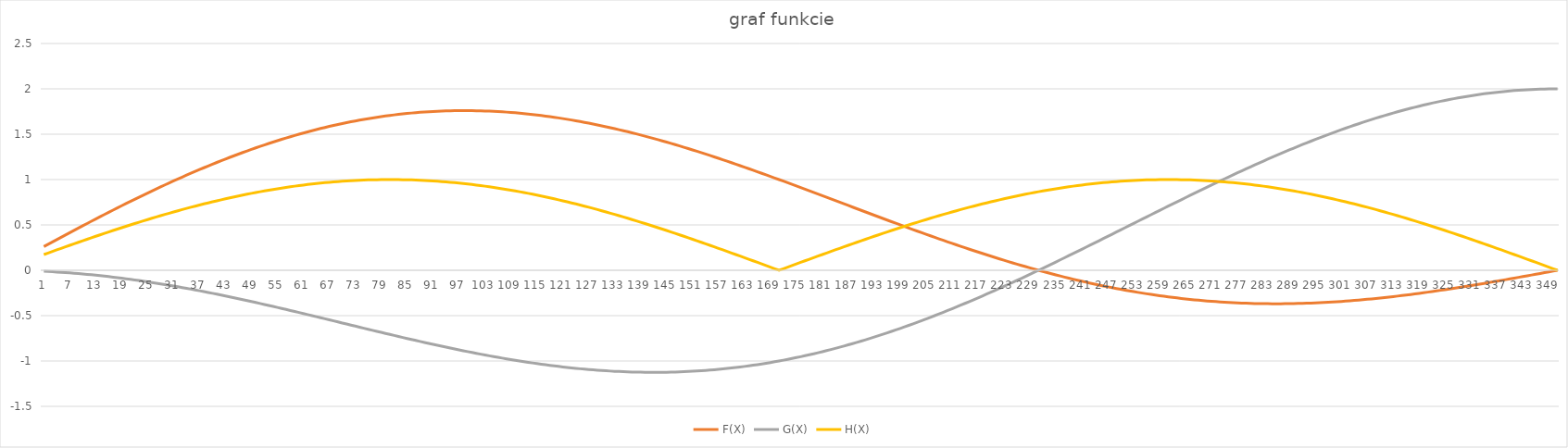
| Category | F(X) | G(X) | H(X) |
|---|---|---|---|
| 0 | 0.261 | -0.011 | 0.174 |
| 1 | 0.287 | -0.014 | 0.191 |
| 2 | 0.312 | -0.016 | 0.208 |
| 3 | 0.338 | -0.019 | 0.225 |
| 4 | 0.364 | -0.022 | 0.242 |
| 5 | 0.389 | -0.026 | 0.259 |
| 6 | 0.415 | -0.029 | 0.276 |
| 7 | 0.44 | -0.033 | 0.292 |
| 8 | 0.465 | -0.037 | 0.309 |
| 9 | 0.491 | -0.041 | 0.326 |
| 10 | 0.516 | -0.045 | 0.342 |
| 11 | 0.541 | -0.05 | 0.358 |
| 12 | 0.565 | -0.054 | 0.375 |
| 13 | 0.59 | -0.059 | 0.391 |
| 14 | 0.615 | -0.065 | 0.407 |
| 15 | 0.639 | -0.07 | 0.423 |
| 16 | 0.663 | -0.076 | 0.438 |
| 17 | 0.687 | -0.081 | 0.454 |
| 18 | 0.711 | -0.087 | 0.469 |
| 19 | 0.735 | -0.094 | 0.485 |
| 20 | 0.759 | -0.1 | 0.5 |
| 21 | 0.782 | -0.106 | 0.515 |
| 22 | 0.806 | -0.113 | 0.53 |
| 23 | 0.829 | -0.12 | 0.545 |
| 24 | 0.852 | -0.127 | 0.559 |
| 25 | 0.874 | -0.135 | 0.574 |
| 26 | 0.897 | -0.142 | 0.588 |
| 27 | 0.919 | -0.15 | 0.602 |
| 28 | 0.941 | -0.158 | 0.616 |
| 29 | 0.963 | -0.165 | 0.629 |
| 30 | 0.985 | -0.174 | 0.643 |
| 31 | 1.006 | -0.182 | 0.656 |
| 32 | 1.027 | -0.19 | 0.669 |
| 33 | 1.048 | -0.199 | 0.682 |
| 34 | 1.069 | -0.208 | 0.695 |
| 35 | 1.09 | -0.217 | 0.707 |
| 36 | 1.11 | -0.226 | 0.719 |
| 37 | 1.13 | -0.235 | 0.731 |
| 38 | 1.15 | -0.244 | 0.743 |
| 39 | 1.169 | -0.254 | 0.755 |
| 40 | 1.189 | -0.264 | 0.766 |
| 41 | 1.208 | -0.273 | 0.777 |
| 42 | 1.226 | -0.283 | 0.788 |
| 43 | 1.245 | -0.293 | 0.799 |
| 44 | 1.263 | -0.303 | 0.809 |
| 45 | 1.281 | -0.313 | 0.819 |
| 46 | 1.299 | -0.324 | 0.829 |
| 47 | 1.316 | -0.334 | 0.839 |
| 48 | 1.333 | -0.345 | 0.848 |
| 49 | 1.35 | -0.355 | 0.857 |
| 50 | 1.366 | -0.366 | 0.866 |
| 51 | 1.382 | -0.377 | 0.875 |
| 52 | 1.398 | -0.388 | 0.883 |
| 53 | 1.414 | -0.399 | 0.891 |
| 54 | 1.429 | -0.41 | 0.899 |
| 55 | 1.444 | -0.421 | 0.906 |
| 56 | 1.458 | -0.432 | 0.914 |
| 57 | 1.472 | -0.443 | 0.921 |
| 58 | 1.486 | -0.454 | 0.927 |
| 59 | 1.5 | -0.466 | 0.934 |
| 60 | 1.513 | -0.477 | 0.94 |
| 61 | 1.526 | -0.489 | 0.946 |
| 62 | 1.539 | -0.5 | 0.951 |
| 63 | 1.551 | -0.511 | 0.956 |
| 64 | 1.563 | -0.523 | 0.961 |
| 65 | 1.575 | -0.535 | 0.966 |
| 66 | 1.586 | -0.546 | 0.97 |
| 67 | 1.597 | -0.558 | 0.974 |
| 68 | 1.607 | -0.569 | 0.978 |
| 69 | 1.618 | -0.581 | 0.982 |
| 70 | 1.628 | -0.592 | 0.985 |
| 71 | 1.637 | -0.604 | 0.988 |
| 72 | 1.646 | -0.616 | 0.99 |
| 73 | 1.655 | -0.627 | 0.993 |
| 74 | 1.664 | -0.639 | 0.995 |
| 75 | 1.672 | -0.65 | 0.996 |
| 76 | 1.68 | -0.662 | 0.998 |
| 77 | 1.687 | -0.673 | 0.999 |
| 78 | 1.694 | -0.684 | 0.999 |
| 79 | 1.701 | -0.696 | 1 |
| 80 | 1.707 | -0.707 | 1 |
| 81 | 1.713 | -0.718 | 1 |
| 82 | 1.719 | -0.73 | 0.999 |
| 83 | 1.724 | -0.741 | 0.999 |
| 84 | 1.729 | -0.752 | 0.998 |
| 85 | 1.733 | -0.763 | 0.996 |
| 86 | 1.738 | -0.774 | 0.995 |
| 87 | 1.742 | -0.784 | 0.993 |
| 88 | 1.745 | -0.795 | 0.99 |
| 89 | 1.748 | -0.806 | 0.988 |
| 90 | 1.751 | -0.816 | 0.985 |
| 91 | 1.753 | -0.827 | 0.982 |
| 92 | 1.755 | -0.837 | 0.978 |
| 93 | 1.757 | -0.847 | 0.974 |
| 94 | 1.758 | -0.858 | 0.97 |
| 95 | 1.759 | -0.868 | 0.966 |
| 96 | 1.76 | -0.877 | 0.961 |
| 97 | 1.76 | -0.887 | 0.956 |
| 98 | 1.76 | -0.897 | 0.951 |
| 99 | 1.76 | -0.906 | 0.946 |
| 100 | 1.759 | -0.916 | 0.94 |
| 101 | 1.758 | -0.925 | 0.934 |
| 102 | 1.756 | -0.934 | 0.927 |
| 103 | 1.754 | -0.943 | 0.921 |
| 104 | 1.752 | -0.951 | 0.914 |
| 105 | 1.75 | -0.96 | 0.906 |
| 106 | 1.747 | -0.968 | 0.899 |
| 107 | 1.744 | -0.976 | 0.891 |
| 108 | 1.74 | -0.985 | 0.883 |
| 109 | 1.736 | -0.992 | 0.875 |
| 110 | 1.732 | -1 | 0.866 |
| 111 | 1.728 | -1.007 | 0.857 |
| 112 | 1.723 | -1.015 | 0.848 |
| 113 | 1.717 | -1.022 | 0.839 |
| 114 | 1.712 | -1.029 | 0.829 |
| 115 | 1.706 | -1.035 | 0.819 |
| 116 | 1.7 | -1.042 | 0.809 |
| 117 | 1.694 | -1.048 | 0.799 |
| 118 | 1.687 | -1.054 | 0.788 |
| 119 | 1.68 | -1.06 | 0.777 |
| 120 | 1.672 | -1.065 | 0.766 |
| 121 | 1.665 | -1.071 | 0.755 |
| 122 | 1.657 | -1.076 | 0.743 |
| 123 | 1.648 | -1.081 | 0.731 |
| 124 | 1.64 | -1.085 | 0.719 |
| 125 | 1.631 | -1.09 | 0.707 |
| 126 | 1.622 | -1.094 | 0.695 |
| 127 | 1.612 | -1.098 | 0.682 |
| 128 | 1.603 | -1.102 | 0.669 |
| 129 | 1.593 | -1.105 | 0.656 |
| 130 | 1.582 | -1.108 | 0.643 |
| 131 | 1.572 | -1.111 | 0.629 |
| 132 | 1.561 | -1.114 | 0.616 |
| 133 | 1.55 | -1.116 | 0.602 |
| 134 | 1.539 | -1.118 | 0.588 |
| 135 | 1.527 | -1.12 | 0.574 |
| 136 | 1.515 | -1.121 | 0.559 |
| 137 | 1.503 | -1.123 | 0.545 |
| 138 | 1.491 | -1.124 | 0.53 |
| 139 | 1.479 | -1.124 | 0.515 |
| 140 | 1.466 | -1.125 | 0.5 |
| 141 | 1.453 | -1.125 | 0.485 |
| 142 | 1.44 | -1.125 | 0.469 |
| 143 | 1.426 | -1.124 | 0.454 |
| 144 | 1.413 | -1.124 | 0.438 |
| 145 | 1.399 | -1.123 | 0.423 |
| 146 | 1.385 | -1.121 | 0.407 |
| 147 | 1.371 | -1.12 | 0.391 |
| 148 | 1.356 | -1.118 | 0.375 |
| 149 | 1.342 | -1.116 | 0.358 |
| 150 | 1.327 | -1.113 | 0.342 |
| 151 | 1.312 | -1.111 | 0.326 |
| 152 | 1.297 | -1.107 | 0.309 |
| 153 | 1.281 | -1.104 | 0.292 |
| 154 | 1.266 | -1.1 | 0.276 |
| 155 | 1.25 | -1.096 | 0.259 |
| 156 | 1.234 | -1.092 | 0.242 |
| 157 | 1.219 | -1.088 | 0.225 |
| 158 | 1.202 | -1.083 | 0.208 |
| 159 | 1.186 | -1.077 | 0.191 |
| 160 | 1.17 | -1.072 | 0.174 |
| 161 | 1.153 | -1.066 | 0.156 |
| 162 | 1.137 | -1.06 | 0.139 |
| 163 | 1.12 | -1.054 | 0.122 |
| 164 | 1.103 | -1.047 | 0.105 |
| 165 | 1.086 | -1.04 | 0.087 |
| 166 | 1.069 | -1.032 | 0.07 |
| 167 | 1.052 | -1.025 | 0.052 |
| 168 | 1.035 | -1.017 | 0.035 |
| 169 | 1.017 | -1.009 | 0.017 |
| 170 | 1 | -1 | 0 |
| 171 | 0.983 | -0.991 | 0.017 |
| 172 | 0.965 | -0.982 | 0.035 |
| 173 | 0.947 | -0.972 | 0.052 |
| 174 | 0.93 | -0.963 | 0.07 |
| 175 | 0.912 | -0.953 | 0.087 |
| 176 | 0.894 | -0.942 | 0.105 |
| 177 | 0.876 | -0.931 | 0.122 |
| 178 | 0.858 | -0.921 | 0.139 |
| 179 | 0.84 | -0.909 | 0.156 |
| 180 | 0.823 | -0.898 | 0.174 |
| 181 | 0.805 | -0.886 | 0.191 |
| 182 | 0.787 | -0.874 | 0.208 |
| 183 | 0.769 | -0.861 | 0.225 |
| 184 | 0.751 | -0.848 | 0.242 |
| 185 | 0.733 | -0.835 | 0.259 |
| 186 | 0.715 | -0.822 | 0.276 |
| 187 | 0.697 | -0.808 | 0.292 |
| 188 | 0.679 | -0.795 | 0.309 |
| 189 | 0.661 | -0.78 | 0.326 |
| 190 | 0.643 | -0.766 | 0.342 |
| 191 | 0.625 | -0.751 | 0.358 |
| 192 | 0.607 | -0.736 | 0.375 |
| 193 | 0.589 | -0.721 | 0.391 |
| 194 | 0.571 | -0.706 | 0.407 |
| 195 | 0.554 | -0.69 | 0.423 |
| 196 | 0.536 | -0.674 | 0.438 |
| 197 | 0.518 | -0.658 | 0.454 |
| 198 | 0.501 | -0.641 | 0.469 |
| 199 | 0.483 | -0.624 | 0.485 |
| 200 | 0.466 | -0.607 | 0.5 |
| 201 | 0.449 | -0.59 | 0.515 |
| 202 | 0.431 | -0.572 | 0.53 |
| 203 | 0.414 | -0.555 | 0.545 |
| 204 | 0.397 | -0.537 | 0.559 |
| 205 | 0.38 | -0.518 | 0.574 |
| 206 | 0.363 | -0.5 | 0.588 |
| 207 | 0.347 | -0.481 | 0.602 |
| 208 | 0.33 | -0.462 | 0.616 |
| 209 | 0.313 | -0.443 | 0.629 |
| 210 | 0.297 | -0.424 | 0.643 |
| 211 | 0.281 | -0.405 | 0.656 |
| 212 | 0.264 | -0.385 | 0.669 |
| 213 | 0.248 | -0.365 | 0.682 |
| 214 | 0.233 | -0.345 | 0.695 |
| 215 | 0.217 | -0.324 | 0.707 |
| 216 | 0.201 | -0.304 | 0.719 |
| 217 | 0.186 | -0.283 | 0.731 |
| 218 | 0.17 | -0.262 | 0.743 |
| 219 | 0.155 | -0.241 | 0.755 |
| 220 | 0.14 | -0.22 | 0.766 |
| 221 | 0.125 | -0.199 | 0.777 |
| 222 | 0.111 | -0.177 | 0.788 |
| 223 | 0.096 | -0.156 | 0.799 |
| 224 | 0.082 | -0.134 | 0.809 |
| 225 | 0.068 | -0.112 | 0.819 |
| 226 | 0.054 | -0.09 | 0.829 |
| 227 | 0.04 | -0.067 | 0.839 |
| 228 | 0.027 | -0.045 | 0.848 |
| 229 | 0.013 | -0.023 | 0.857 |
| 230 | 0 | 0 | 0.866 |
| 231 | -0.013 | 0.023 | 0.875 |
| 232 | -0.026 | 0.046 | 0.883 |
| 233 | -0.038 | 0.069 | 0.891 |
| 234 | -0.051 | 0.092 | 0.899 |
| 235 | -0.063 | 0.115 | 0.906 |
| 236 | -0.075 | 0.138 | 0.914 |
| 237 | -0.087 | 0.161 | 0.921 |
| 238 | -0.098 | 0.185 | 0.927 |
| 239 | -0.109 | 0.208 | 0.934 |
| 240 | -0.121 | 0.232 | 0.94 |
| 241 | -0.131 | 0.255 | 0.946 |
| 242 | -0.142 | 0.279 | 0.951 |
| 243 | -0.152 | 0.302 | 0.956 |
| 244 | -0.163 | 0.326 | 0.961 |
| 245 | -0.173 | 0.35 | 0.966 |
| 246 | -0.182 | 0.374 | 0.97 |
| 247 | -0.192 | 0.398 | 0.974 |
| 248 | -0.201 | 0.421 | 0.978 |
| 249 | -0.21 | 0.445 | 0.982 |
| 250 | -0.219 | 0.469 | 0.985 |
| 251 | -0.227 | 0.493 | 0.988 |
| 252 | -0.236 | 0.517 | 0.99 |
| 253 | -0.244 | 0.541 | 0.993 |
| 254 | -0.251 | 0.565 | 0.995 |
| 255 | -0.259 | 0.588 | 0.996 |
| 256 | -0.266 | 0.612 | 0.998 |
| 257 | -0.273 | 0.636 | 0.999 |
| 258 | -0.28 | 0.66 | 0.999 |
| 259 | -0.287 | 0.683 | 1 |
| 260 | -0.293 | 0.707 | 1 |
| 261 | -0.299 | 0.731 | 1 |
| 262 | -0.305 | 0.754 | 0.999 |
| 263 | -0.31 | 0.778 | 0.999 |
| 264 | -0.316 | 0.801 | 0.998 |
| 265 | -0.321 | 0.824 | 0.996 |
| 266 | -0.325 | 0.848 | 0.995 |
| 267 | -0.33 | 0.871 | 0.993 |
| 268 | -0.334 | 0.894 | 0.99 |
| 269 | -0.338 | 0.917 | 0.988 |
| 270 | -0.342 | 0.94 | 0.985 |
| 271 | -0.346 | 0.962 | 0.982 |
| 272 | -0.349 | 0.985 | 0.978 |
| 273 | -0.352 | 1.008 | 0.974 |
| 274 | -0.355 | 1.03 | 0.97 |
| 275 | -0.357 | 1.052 | 0.966 |
| 276 | -0.359 | 1.074 | 0.961 |
| 277 | -0.361 | 1.096 | 0.956 |
| 278 | -0.363 | 1.118 | 0.951 |
| 279 | -0.365 | 1.14 | 0.946 |
| 280 | -0.366 | 1.161 | 0.94 |
| 281 | -0.367 | 1.182 | 0.934 |
| 282 | -0.368 | 1.204 | 0.927 |
| 283 | -0.369 | 1.225 | 0.921 |
| 284 | -0.369 | 1.245 | 0.914 |
| 285 | -0.369 | 1.266 | 0.906 |
| 286 | -0.369 | 1.286 | 0.899 |
| 287 | -0.369 | 1.307 | 0.891 |
| 288 | -0.368 | 1.327 | 0.883 |
| 289 | -0.367 | 1.346 | 0.875 |
| 290 | -0.366 | 1.366 | 0.866 |
| 291 | -0.365 | 1.385 | 0.857 |
| 292 | -0.363 | 1.405 | 0.848 |
| 293 | -0.362 | 1.423 | 0.839 |
| 294 | -0.36 | 1.442 | 0.829 |
| 295 | -0.357 | 1.461 | 0.819 |
| 296 | -0.355 | 1.479 | 0.809 |
| 297 | -0.352 | 1.497 | 0.799 |
| 298 | -0.35 | 1.514 | 0.788 |
| 299 | -0.347 | 1.532 | 0.777 |
| 300 | -0.343 | 1.549 | 0.766 |
| 301 | -0.34 | 1.566 | 0.755 |
| 302 | -0.336 | 1.583 | 0.743 |
| 303 | -0.333 | 1.599 | 0.731 |
| 304 | -0.329 | 1.615 | 0.719 |
| 305 | -0.324 | 1.631 | 0.707 |
| 306 | -0.32 | 1.647 | 0.695 |
| 307 | -0.315 | 1.662 | 0.682 |
| 308 | -0.311 | 1.677 | 0.669 |
| 309 | -0.306 | 1.691 | 0.656 |
| 310 | -0.301 | 1.706 | 0.643 |
| 311 | -0.296 | 1.72 | 0.629 |
| 312 | -0.29 | 1.734 | 0.616 |
| 313 | -0.285 | 1.747 | 0.602 |
| 314 | -0.279 | 1.76 | 0.588 |
| 315 | -0.273 | 1.773 | 0.574 |
| 316 | -0.267 | 1.785 | 0.559 |
| 317 | -0.261 | 1.797 | 0.545 |
| 318 | -0.254 | 1.809 | 0.53 |
| 319 | -0.248 | 1.821 | 0.515 |
| 320 | -0.241 | 1.832 | 0.5 |
| 321 | -0.234 | 1.843 | 0.485 |
| 322 | -0.228 | 1.853 | 0.469 |
| 323 | -0.221 | 1.863 | 0.454 |
| 324 | -0.213 | 1.873 | 0.438 |
| 325 | -0.206 | 1.883 | 0.423 |
| 326 | -0.199 | 1.892 | 0.407 |
| 327 | -0.191 | 1.9 | 0.391 |
| 328 | -0.184 | 1.909 | 0.375 |
| 329 | -0.176 | 1.917 | 0.358 |
| 330 | -0.168 | 1.925 | 0.342 |
| 331 | -0.161 | 1.932 | 0.326 |
| 332 | -0.153 | 1.939 | 0.309 |
| 333 | -0.145 | 1.945 | 0.292 |
| 334 | -0.136 | 1.952 | 0.276 |
| 335 | -0.128 | 1.957 | 0.259 |
| 336 | -0.12 | 1.963 | 0.242 |
| 337 | -0.112 | 1.968 | 0.225 |
| 338 | -0.103 | 1.973 | 0.208 |
| 339 | -0.095 | 1.977 | 0.191 |
| 340 | -0.086 | 1.981 | 0.174 |
| 341 | -0.078 | 1.985 | 0.156 |
| 342 | -0.069 | 1.988 | 0.139 |
| 343 | -0.061 | 1.991 | 0.122 |
| 344 | -0.052 | 1.993 | 0.105 |
| 345 | -0.044 | 1.995 | 0.087 |
| 346 | -0.035 | 1.997 | 0.07 |
| 347 | -0.026 | 1.998 | 0.052 |
| 348 | -0.017 | 1.999 | 0.035 |
| 349 | -0.009 | 2 | 0.017 |
| 350 | 0 | 2 | 0 |